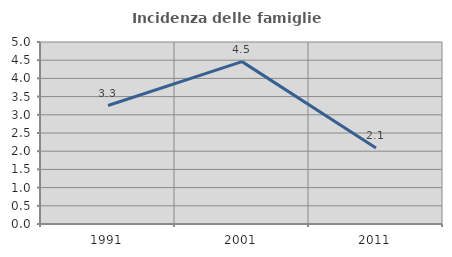
| Category | Incidenza delle famiglie numerose |
|---|---|
| 1991.0 | 3.254 |
| 2001.0 | 4.461 |
| 2011.0 | 2.09 |